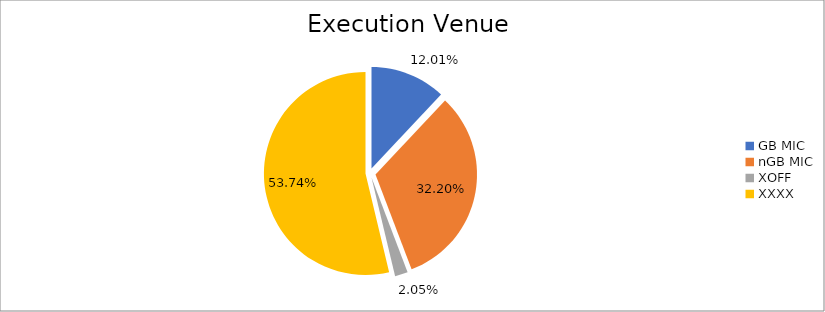
| Category | Series 0 |
|---|---|
| GB MIC | 1105731.876 |
| nGB MIC | 2963606.011 |
| XOFF | 188405.965 |
| XXXX | 4946013.644 |